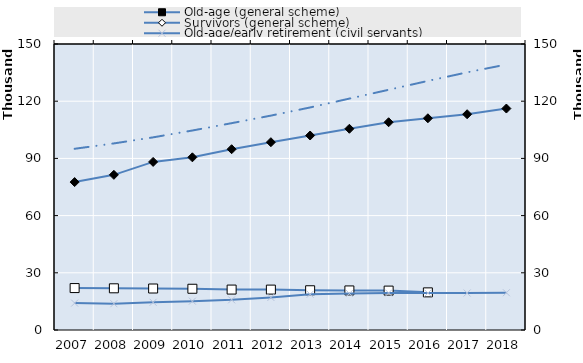
| Category | Old-age (general scheme) | Survivors (general scheme) |
|---|---|---|
| 2007.0 | 77578 | 21994 |
| 2008.0 | 81377 | 21865 |
| 2009.0 | 88156 | 21763 |
| 2010.0 | 90569 | 21632 |
| 2011.0 | 94822 | 21207 |
| 2012.0 | 98500 | 21186 |
| 2013.0 | 102005 | 20842 |
| 2014.0 | 105539 | 20754 |
| 2015.0 | 108967 | 20660 |
| 2016.0 | 111047 | 19739 |
| 2017.0 | 113167 | 0 |
| 2018.0 | 116154 | 0 |